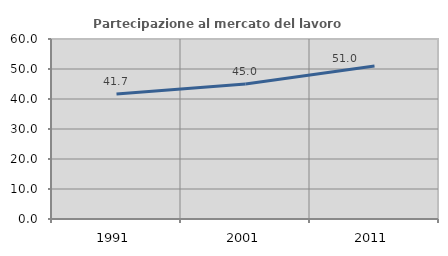
| Category | Partecipazione al mercato del lavoro  femminile |
|---|---|
| 1991.0 | 41.674 |
| 2001.0 | 44.992 |
| 2011.0 | 51.001 |